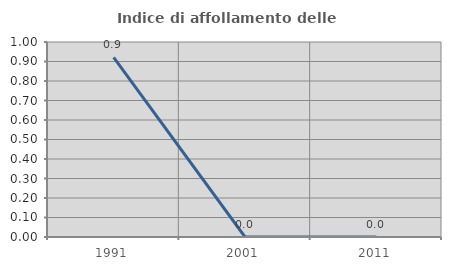
| Category | Indice di affollamento delle abitazioni  |
|---|---|
| 1991.0 | 0.922 |
| 2001.0 | 0 |
| 2011.0 | 0 |